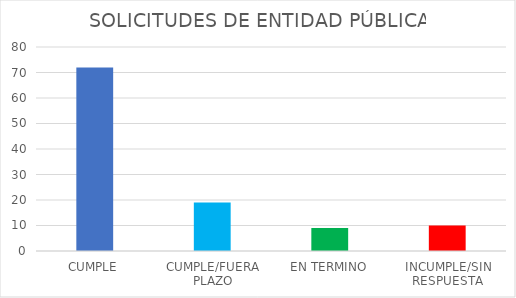
| Category | TOTAL |
|---|---|
| CUMPLE | 72 |
| CUMPLE/FUERA PLAZO | 19 |
| EN TERMINO | 9 |
| INCUMPLE/SIN RESPUESTA | 10 |